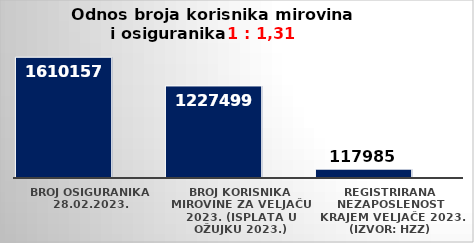
| Category | Series 0 | Series 1 |
|---|---|---|
| Broj osiguranika 28.02.2023. | 1610157 |  |
| Broj korisnika mirovine za veljaču 2023. (isplata u ožujku 2023.) | 1227499 |  |
| Registrirana nezaposlenost krajem veljače 2023. (izvor: HZZ) | 117985 |  |